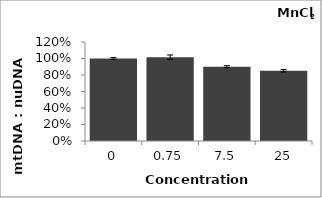
| Category | Series 1 |
|---|---|
| 0.0 | 1 |
| 0.75 | 1.016 |
| 7.5 | 0.901 |
| 25.0 | 0.851 |